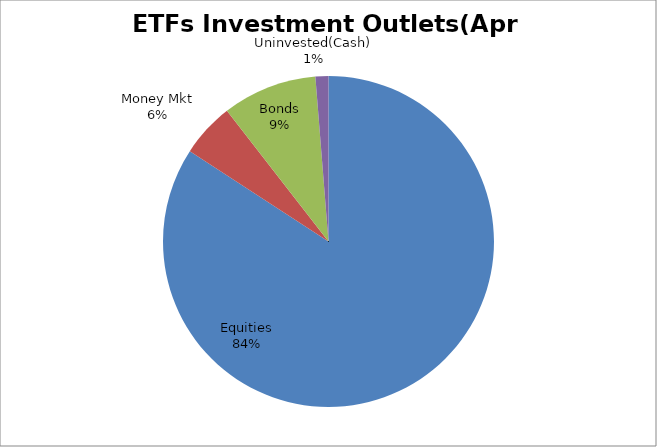
| Category | Series 0 |
|---|---|
| Equities | 4191729465.72 |
| Money Mkt | 263468874.03 |
| Bonds | 460460354.97 |
| Uninvested(Cash) | 63029070.21 |